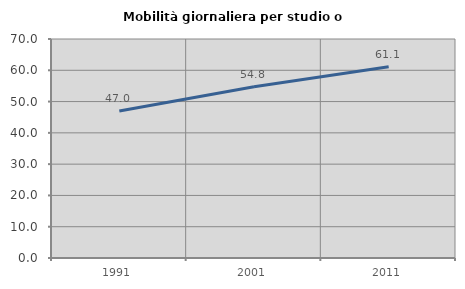
| Category | Mobilità giornaliera per studio o lavoro |
|---|---|
| 1991.0 | 46.988 |
| 2001.0 | 54.764 |
| 2011.0 | 61.097 |